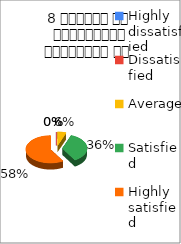
| Category | 8 शिक्षक का सम्प्रेषण सुस्पष्ठ है  |
|---|---|
| Highly dissatisfied | 0 |
| Dissatisfied | 0 |
| Average | 3 |
| Satisfied | 19 |
| Highly satisfied | 31 |